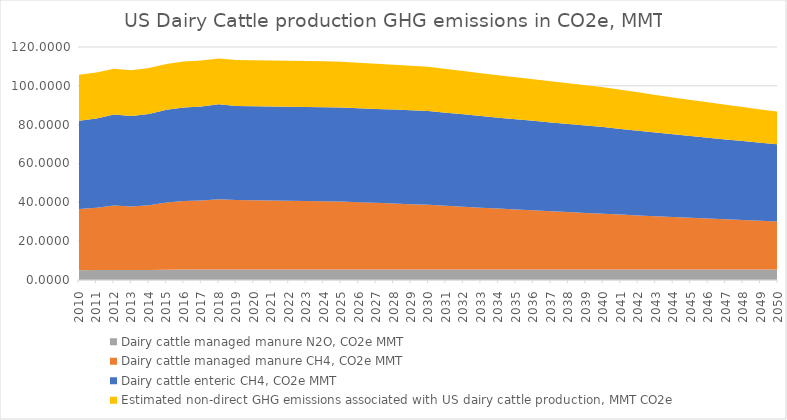
| Category | Dairy cattle managed manure N2O, CO2e MMT | Dairy cattle managed manure CH4, CO2e MMT | Dairy cattle enteric CH4, CO2e MMT | Estimated non-direct GHG emissions associated with US dairy cattle production, MMT CO2e |
|---|---|---|---|---|
| 2010.0 | 5.035 | 31.472 | 45.556 | 23.622 |
| 2011.0 | 5.115 | 32.032 | 46.06 | 23.622 |
| 2012.0 | 5.168 | 33.264 | 46.76 | 23.622 |
| 2013.0 | 5.141 | 32.676 | 46.592 | 23.622 |
| 2014.0 | 5.194 | 33.32 | 47.012 | 23.622 |
| 2015.0 | 5.326 | 34.524 | 47.768 | 23.622 |
| 2016.0 | 5.38 | 35.252 | 48.216 | 23.622 |
| 2017.0 | 5.406 | 35.56 | 48.44 | 23.622 |
| 2018.0 | 5.459 | 36.176 | 48.832 | 23.622 |
| 2019.0 | 5.38 | 35.868 | 48.412 | 23.622 |
| 2020.0 | 5.406 | 35.726 | 48.412 | 23.622 |
| 2021.0 | 5.406 | 35.584 | 48.412 | 23.622 |
| 2022.0 | 5.406 | 35.443 | 48.412 | 23.622 |
| 2023.0 | 5.406 | 35.302 | 48.412 | 23.622 |
| 2024.0 | 5.406 | 35.162 | 48.412 | 23.622 |
| 2025.0 | 5.406 | 35.023 | 48.412 | 23.622 |
| 2026.0 | 5.406 | 34.676 | 48.399 | 23.445 |
| 2027.0 | 5.406 | 34.332 | 48.387 | 23.269 |
| 2028.0 | 5.406 | 33.992 | 48.374 | 23.094 |
| 2029.0 | 5.406 | 33.655 | 48.361 | 22.921 |
| 2030.0 | 5.406 | 33.322 | 48.348 | 22.749 |
| 2031.0 | 5.406 | 32.826 | 47.963 | 22.522 |
| 2032.0 | 5.406 | 32.339 | 47.581 | 22.296 |
| 2033.0 | 5.406 | 31.858 | 47.203 | 22.073 |
| 2034.0 | 5.406 | 31.385 | 46.829 | 21.853 |
| 2035.0 | 5.406 | 30.919 | 46.459 | 21.634 |
| 2036.0 | 5.406 | 30.46 | 46.092 | 21.418 |
| 2037.0 | 5.406 | 30.007 | 45.73 | 21.204 |
| 2038.0 | 5.406 | 29.562 | 45.37 | 20.992 |
| 2039.0 | 5.406 | 29.123 | 45.015 | 20.782 |
| 2040.0 | 5.406 | 28.691 | 44.662 | 20.574 |
| 2041.0 | 5.406 | 28.265 | 44.139 | 20.162 |
| 2042.0 | 5.406 | 27.846 | 43.624 | 19.759 |
| 2043.0 | 5.406 | 27.433 | 43.117 | 19.364 |
| 2044.0 | 5.406 | 27.026 | 42.617 | 18.977 |
| 2045.0 | 5.406 | 26.625 | 42.125 | 18.597 |
| 2046.0 | 5.406 | 26.23 | 41.64 | 18.225 |
| 2047.0 | 5.406 | 25.841 | 41.163 | 17.861 |
| 2048.0 | 5.406 | 25.458 | 40.692 | 17.503 |
| 2049.0 | 5.406 | 25.081 | 40.229 | 17.153 |
| 2050.0 | 5.406 | 24.71 | 39.772 | 16.81 |